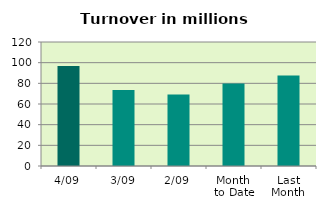
| Category | Series 0 |
|---|---|
| 4/09 | 96.885 |
| 3/09 | 73.627 |
| 2/09 | 69.073 |
| Month 
to Date | 79.861 |
| Last
Month | 87.619 |